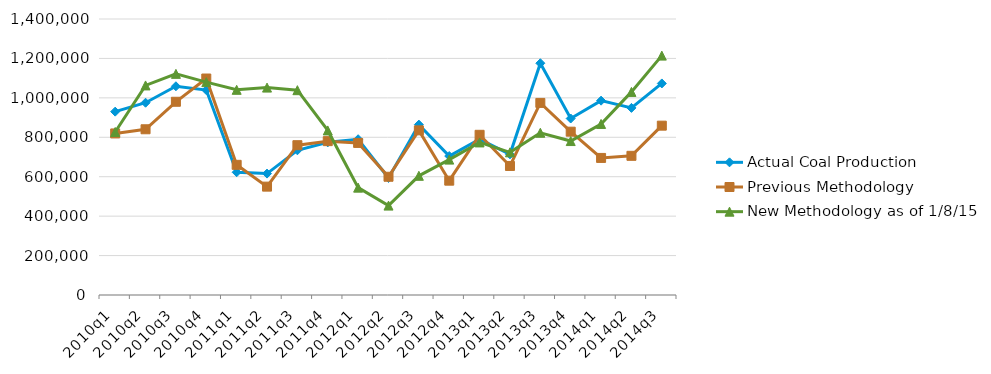
| Category | Actual Coal Production | Previous Methodology | New Methodology as of 1/8/15 |
|---|---|---|---|
| 2010q1 | 930066 | 819445 | 826886 |
| 2010q2 | 975330 | 840635 | 1063031 |
| 2010q3 | 1058776 | 980110 | 1121688 |
| 2010q4 | 1039333 | 1098105 | 1079801 |
| 2011q1 | 622582 | 660256 | 1040788 |
| 2011q2 | 615888 | 549694 | 1051985 |
| 2011q3 | 733980 | 759844 | 1038954 |
| 2011q4 | 774294 | 780392 | 834767 |
| 2012q1 | 790136 | 771333 | 544655 |
| 2012q2 | 593537 | 599769 | 453462 |
| 2012q3 | 864250 | 835181 | 604609 |
| 2012q4 | 704895 | 579937 | 686723 |
| 2013q1 | 790415 | 812611 | 773935 |
| 2013q2 | 713745 | 654513 | 723732 |
| 2013q3 | 1175675 | 974311 | 822960 |
| 2013q4 | 895234 | 828466 | 780920 |
| 2014q1 | 985785 | 695274 | 867684 |
| 2014q2 | 949047 | 705946 | 1030183 |
| 2014q3 | 1073129 | 858940 | 1214271 |